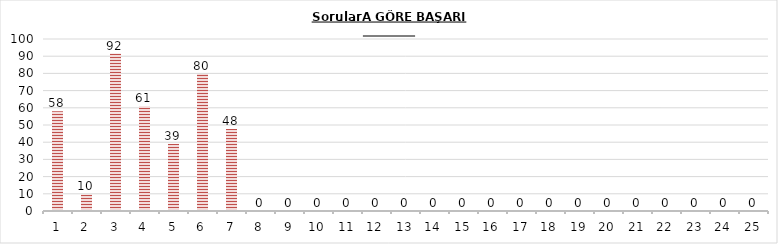
| Category | Series 0 |
|---|---|
| 0 | 57.949 |
| 1 | 9.615 |
| 2 | 91.538 |
| 3 | 60.962 |
| 4 | 39.038 |
| 5 | 79.615 |
| 6 | 47.692 |
| 7 | 0 |
| 8 | 0 |
| 9 | 0 |
| 10 | 0 |
| 11 | 0 |
| 12 | 0 |
| 13 | 0 |
| 14 | 0 |
| 15 | 0 |
| 16 | 0 |
| 17 | 0 |
| 18 | 0 |
| 19 | 0 |
| 20 | 0 |
| 21 | 0 |
| 22 | 0 |
| 23 | 0 |
| 24 | 0 |